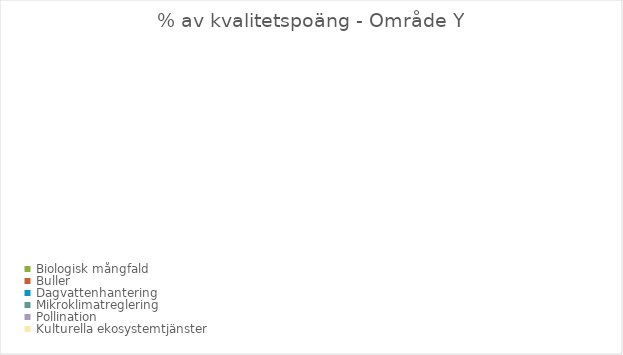
| Category | Series 0 |
|---|---|
| Biologisk mångfald  | 0 |
| Buller | 0 |
| Dagvattenhantering | 0 |
| Mikroklimatreglering | 0 |
| Pollination | 0 |
| Kulturella ekosystemtjänster | 0 |